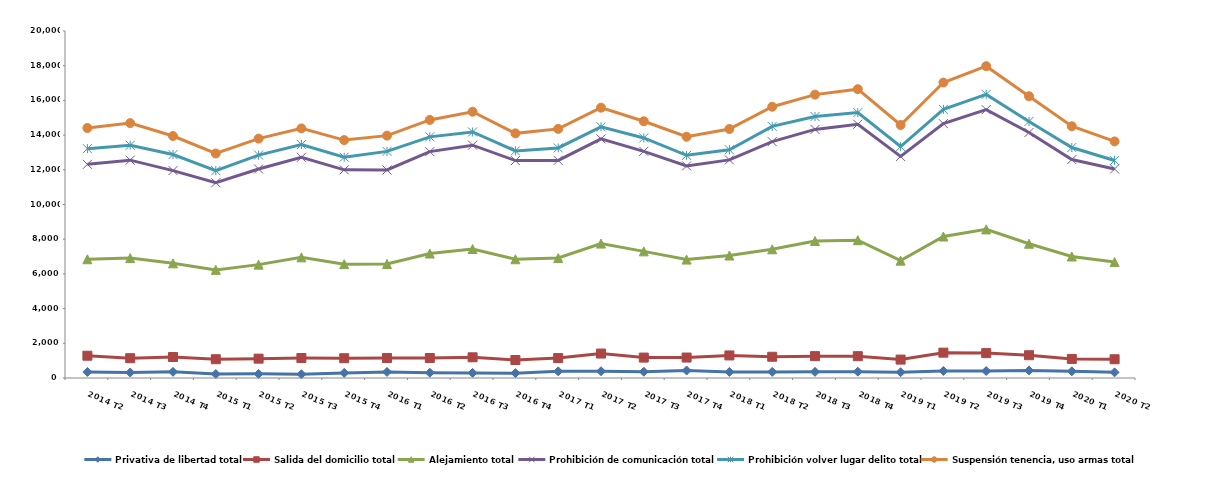
| Category | Privativa de libertad total | Salida del domicilio total | Alejamiento total | Prohibición de comunicación total | Prohibición volver lugar delito total | Suspensión tenencia, uso armas total |
|---|---|---|---|---|---|---|
| 2014 T2 | 347 | 937 | 5561 | 5471 | 903 | 1189 |
| 2014 T3 | 317 | 824 | 5769 | 5646 | 860 | 1275 |
| 2014 T4 | 355 | 855 | 5398 | 5347 | 923 | 1068 |
| 2015 T1 | 229 | 853 | 5150 | 5026 | 695 | 988 |
| 2015 T2 | 238 | 877 | 5419 | 5513 | 802 | 948 |
| 2015 T3 | 216 | 937 | 5800 | 5766 | 739 | 929 |
| 2015 T4 | 295 | 846 | 5420 | 5437 | 727 | 988 |
| 2016 T1 | 351 | 803 | 5416 | 5420 | 1072 | 908 |
| 2016 T2 | 306 | 846 | 6022 | 5873 | 852 | 975 |
| 2016 T3 | 295 | 898 | 6241 | 5985 | 762 | 1166 |
| 2016 T4 | 280 | 757 | 5807 | 5686 | 560 | 1010 |
| 2017 T1 | 385 | 763 | 5769 | 5625 | 720 | 1097 |
| 2017 T2 | 389 | 1020 | 6337 | 6036 | 695 | 1103 |
| 2017 T3 | 360 | 817 | 6122 | 5765 | 770 | 963 |
| 2017 T4 | 432 | 747 | 5646 | 5399 | 610 | 1069 |
| 2018 T1 | 350 | 950 | 5758 | 5513 | 585 | 1196 |
| 2018 T2 | 352 | 872 | 6194 | 6206 | 877 | 1133 |
| 2018 T3 | 354 | 906 | 6638 | 6430 | 743 | 1263 |
| 2018 T4 | 364 | 894 | 6685 | 6685 | 670 | 1349 |
| 2019 T1 | 334 | 727 | 5704 | 6003 | 573 | 1243 |
| 2019 T2 | 406 | 1055 | 6694 | 6504 | 827 | 1543 |
| 2019 T3 | 401 | 1035 | 7130 | 6902 | 880 | 1624 |
| 2019 T4 | 437 | 876 | 6426 | 6409 | 640 | 1450 |
| 2020 T1 | 387 | 713 | 5904 | 5586 | 692 | 1228 |
| 2020 T2 | 325 | 755 | 5603 | 5367 | 488 | 1099 |